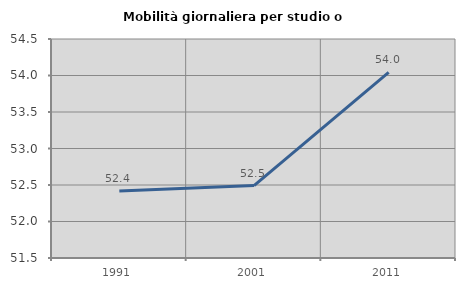
| Category | Mobilità giornaliera per studio o lavoro |
|---|---|
| 1991.0 | 52.417 |
| 2001.0 | 52.492 |
| 2011.0 | 54.043 |